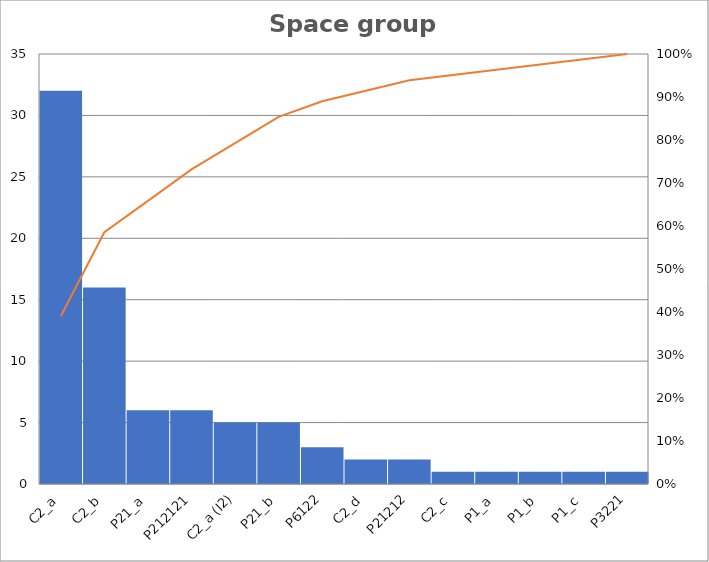
| Category | Series 0 |
|---|---|
| C2_a | 32 |
| C2_b | 16 |
| P21_a | 6 |
| P212121 | 6 |
| C2_a (I2) | 5 |
| P21_b | 5 |
| P6122 | 3 |
| C2_d | 2 |
| P21212 | 2 |
| C2_c | 1 |
| P1_a | 1 |
| P1_b | 1 |
| P1_c | 1 |
| P3221 | 1 |